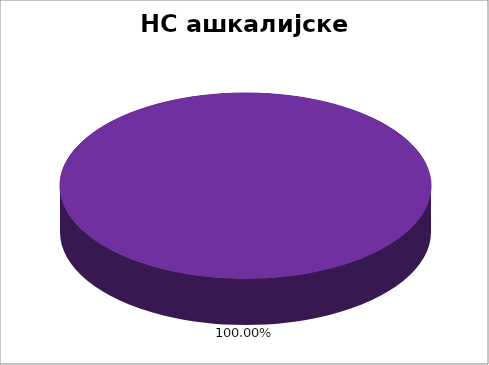
| Category | НС ашкалијске НМ |
|---|---|
| 0 | 0 |
| 1 | 0 |
| 2 | 0 |
| 3 | 0 |
| 4 | 1 |